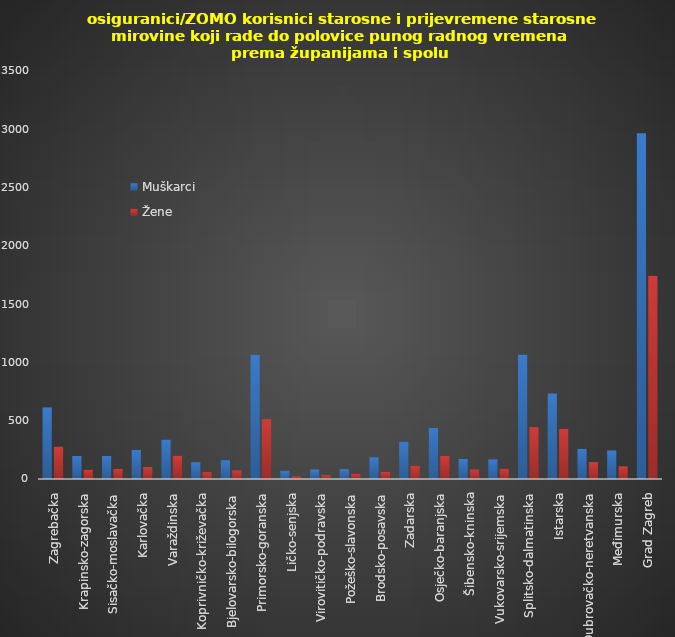
| Category | Muškarci | Žene |
|---|---|---|
| Zagrebačka | 614 | 278 |
| Krapinsko-zagorska | 197 | 79 |
| Sisačko-moslavačka | 197 | 87 |
| Karlovačka | 250 | 103 |
| Varaždinska | 338 | 200 |
| Koprivničko-križevačka | 144 | 59 |
| Bjelovarsko-bilogorska | 161 | 74 |
| Primorsko-goranska | 1066 | 513 |
| Ličko-senjska | 71 | 22 |
| Virovitičko-podravska | 82 | 35 |
| Požeško-slavonska | 85 | 43 |
| Brodsko-posavska | 186 | 62 |
| Zadarska | 321 | 114 |
| Osječko-baranjska | 437 | 197 |
| Šibensko-kninska | 172 | 82 |
| Vukovarsko-srijemska | 168 | 88 |
| Splitsko-dalmatinska | 1067 | 445 |
| Istarska | 734 | 430 |
| Dubrovačko-neretvanska | 259 | 145 |
| Međimurska | 245 | 109 |
| Grad Zagreb | 2967 | 1743 |